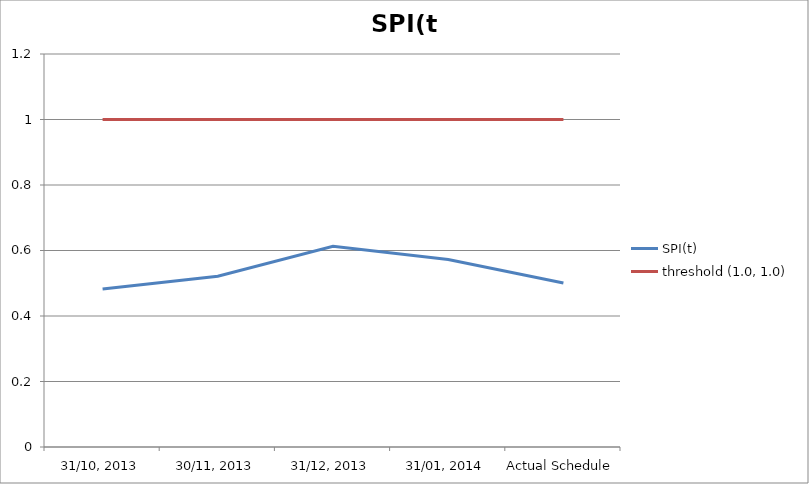
| Category | SPI(t) | threshold (1.0, 1.0) |
|---|---|---|
| 31/10, 2013 | 0.482 | 1 |
| 30/11, 2013 | 0.521 | 1 |
| 31/12, 2013 | 0.613 | 1 |
| 31/01, 2014 | 0.573 | 1 |
| Actual Schedule | 0.501 | 1 |